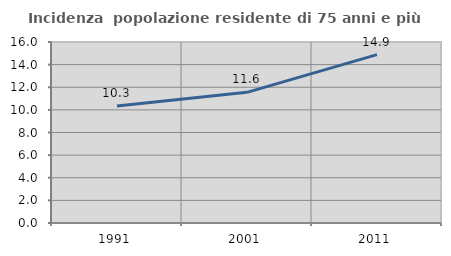
| Category | Incidenza  popolazione residente di 75 anni e più |
|---|---|
| 1991.0 | 10.345 |
| 2001.0 | 11.552 |
| 2011.0 | 14.885 |